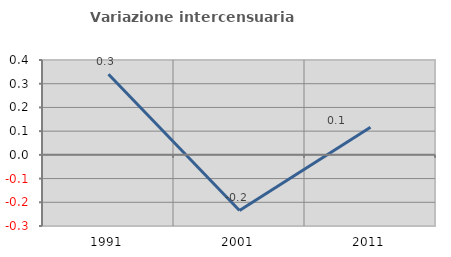
| Category | Variazione intercensuaria annua |
|---|---|
| 1991.0 | 0.34 |
| 2001.0 | -0.235 |
| 2011.0 | 0.116 |